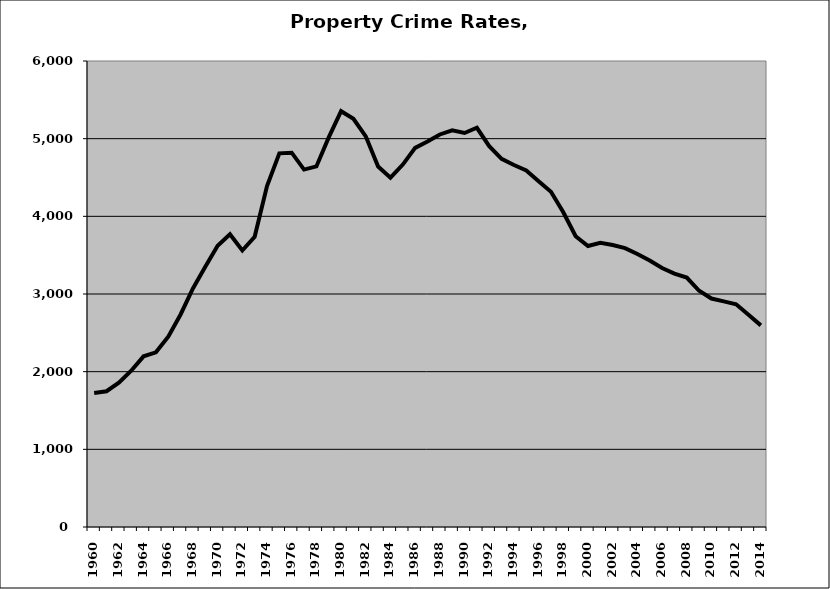
| Category | Property |
|---|---|
| 1960.0 | 1726.325 |
| 1961.0 | 1747.945 |
| 1962.0 | 1857.502 |
| 1963.0 | 2012.118 |
| 1964.0 | 2197.54 |
| 1965.0 | 2248.793 |
| 1966.0 | 2450.863 |
| 1967.0 | 2736.545 |
| 1968.0 | 3071.831 |
| 1969.0 | 3351.292 |
| 1970.0 | 3621.025 |
| 1971.0 | 3768.791 |
| 1972.0 | 3560.438 |
| 1973.0 | 3737.032 |
| 1974.0 | 4389.334 |
| 1975.0 | 4810.674 |
| 1976.0 | 4819.504 |
| 1977.0 | 4601.723 |
| 1978.0 | 4642.505 |
| 1979.0 | 5016.606 |
| 1980.0 | 5353.335 |
| 1981.0 | 5256.515 |
| 1982.0 | 5029.688 |
| 1983.0 | 4641.11 |
| 1984.0 | 4498.453 |
| 1985.0 | 4666.448 |
| 1986.0 | 4881.755 |
| 1987.0 | 4962.963 |
| 1988.0 | 5053.954 |
| 1989.0 | 5107.143 |
| 1990.0 | 5073.063 |
| 1991.0 | 5140.177 |
| 1992.0 | 4903.71 |
| 1993.0 | 4739.954 |
| 1994.0 | 4660.243 |
| 1995.0 | 4590.481 |
| 1996.0 | 4451 |
| 1997.0 | 4316.349 |
| 1998.0 | 4052.51 |
| 1999.0 | 3743.556 |
| 2000.0 | 3618.263 |
| 2001.0 | 3658.096 |
| 2002.0 | 3630.633 |
| 2003.0 | 3591.217 |
| 2004.0 | 3514.097 |
| 2005.0 | 3431.539 |
| 2006.0 | 3334.542 |
| 2007.0 | 3263.525 |
| 2008.0 | 3211.55 |
| 2009.0 | 3041.323 |
| 2010.0 | 2941.868 |
| 2011.0 | 2905.358 |
| 2012.0 | 2868.03 |
| 2013.0 | 2733.279 |
| 2014.0 | 2596.094 |